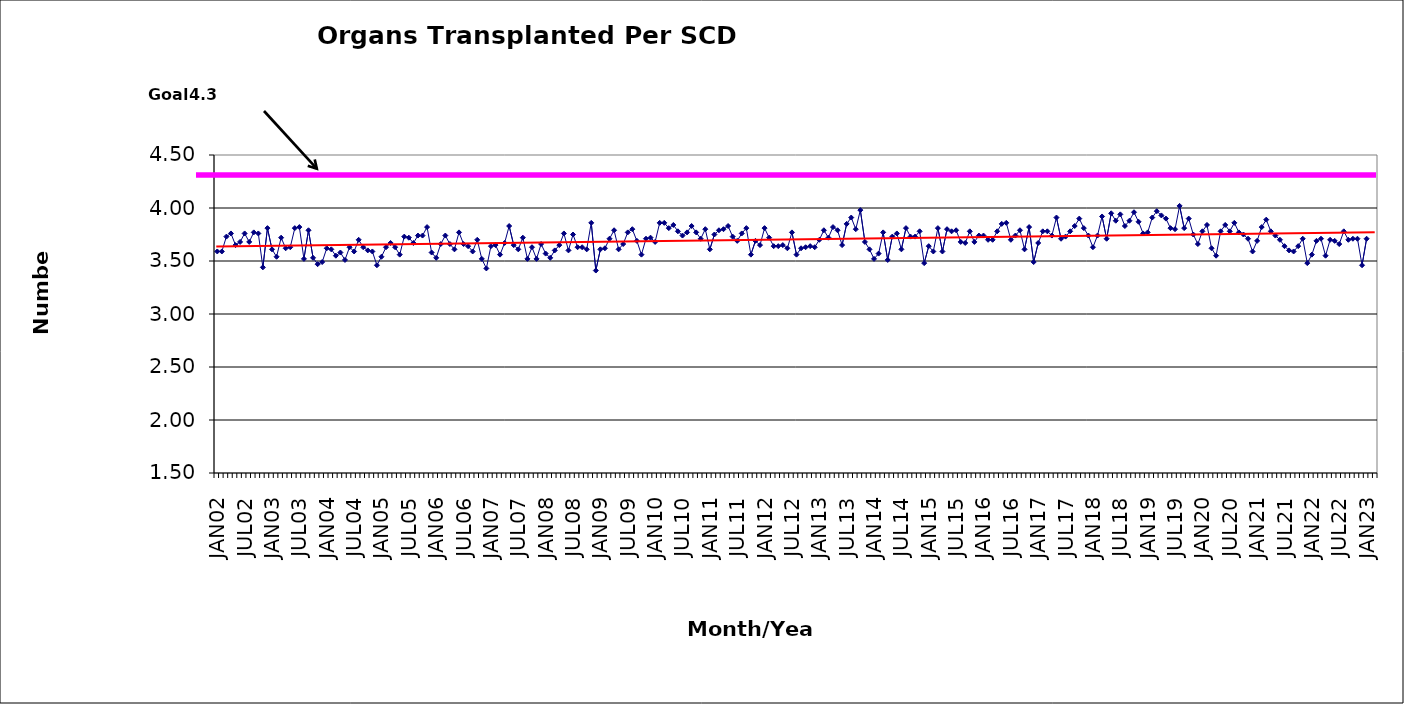
| Category | Series 0 |
|---|---|
| JAN02 | 3.59 |
| FEB02 | 3.59 |
| MAR02 | 3.73 |
| APR02 | 3.76 |
| MAY02 | 3.65 |
| JUN02 | 3.68 |
| JUL02 | 3.76 |
| AUG02 | 3.68 |
| SEP02 | 3.77 |
| OCT02 | 3.76 |
| NOV02 | 3.44 |
| DEC02 | 3.81 |
| JAN03 | 3.61 |
| FEB03 | 3.54 |
| MAR03 | 3.72 |
| APR03 | 3.62 |
| MAY03 | 3.63 |
| JUN03 | 3.81 |
| JUL03 | 3.82 |
| AUG03 | 3.52 |
| SEP03 | 3.79 |
| OCT03 | 3.53 |
| NOV03 | 3.47 |
| DEC03 | 3.49 |
| JAN04 | 3.62 |
| FEB04 | 3.61 |
| MAR04 | 3.55 |
| APR04 | 3.58 |
| MAY04 | 3.51 |
| JUN04 | 3.63 |
| JUL04 | 3.59 |
| AUG04 | 3.7 |
| SEP04 | 3.63 |
| OCT04 | 3.6 |
| NOV04 | 3.59 |
| DEC04 | 3.46 |
| JAN05 | 3.54 |
| FEB05 | 3.63 |
| MAR05 | 3.67 |
| APR05 | 3.63 |
| MAY05 | 3.56 |
| JUN05 | 3.73 |
| JUL05 | 3.72 |
| AUG05 | 3.67 |
| SEP05 | 3.74 |
| OCT05 | 3.74 |
| NOV05 | 3.82 |
| DEC05 | 3.58 |
| JAN06 | 3.53 |
| FEB06 | 3.66 |
| MAR06 | 3.74 |
| APR06 | 3.66 |
| MAY06 | 3.61 |
| JUN06 | 3.77 |
| JUL06 | 3.66 |
| AUG06 | 3.64 |
| SEP06 | 3.59 |
| OCT06 | 3.7 |
| NOV06 | 3.52 |
| DEC06 | 3.43 |
| JAN07 | 3.64 |
| FEB07 | 3.65 |
| MAR07 | 3.56 |
| APR07 | 3.67 |
| MAY07 | 3.83 |
| JUN07 | 3.65 |
| JUL07 | 3.61 |
| AUG07 | 3.72 |
| SEP07 | 3.52 |
| OCT07 | 3.63 |
| NOV07 | 3.52 |
| DEC07 | 3.66 |
| JAN08 | 3.57 |
| FEB08 | 3.53 |
| MAR08 | 3.6 |
| APR08 | 3.65 |
| MAY08 | 3.76 |
| JUN08 | 3.6 |
| JUL08 | 3.75 |
| AUG08 | 3.63 |
| SEP08 | 3.63 |
| OCT08 | 3.61 |
| NOV08 | 3.86 |
| DEC08 | 3.41 |
| JAN09 | 3.61 |
| FEB09 | 3.62 |
| MAR09 | 3.71 |
| APR09 | 3.79 |
| MAY09 | 3.61 |
| JUN09 | 3.66 |
| JUL09 | 3.77 |
| AUG09 | 3.8 |
| SEP09 | 3.69 |
| OCT09 | 3.56 |
| NOV09 | 3.71 |
| DEC09 | 3.72 |
| JAN10 | 3.68 |
| FEB10 | 3.86 |
| MAR10 | 3.86 |
| APR10 | 3.81 |
| MAY10 | 3.84 |
| JUN10 | 3.78 |
| JUL10 | 3.74 |
| AUG10 | 3.77 |
| SEP10 | 3.83 |
| OCT10 | 3.77 |
| NOV10 | 3.71 |
| DEC10 | 3.8 |
| JAN11 | 3.61 |
| FEB11 | 3.75 |
| MAR11 | 3.79 |
| APR11 | 3.8 |
| MAY11 | 3.83 |
| JUN11 | 3.73 |
| JUL11 | 3.69 |
| AUG11 | 3.76 |
| SEP11 | 3.81 |
| OCT11 | 3.56 |
| NOV11 | 3.69 |
| DEC11 | 3.65 |
| JAN12 | 3.81 |
| FEB12 | 3.72 |
| MAR12 | 3.64 |
| APR12 | 3.64 |
| MAY12 | 3.65 |
| JUN12 | 3.62 |
| JUL12 | 3.77 |
| AUG12 | 3.56 |
| SEP12 | 3.62 |
| OCT12 | 3.63 |
| NOV12 | 3.64 |
| DEC12 | 3.63 |
| JAN13 | 3.7 |
| FEB13 | 3.79 |
| MAR13 | 3.72 |
| APR13 | 3.82 |
| MAY13 | 3.79 |
| JUN13 | 3.65 |
| JUL13 | 3.85 |
| AUG13 | 3.91 |
| SEP13 | 3.8 |
| OCT13 | 3.98 |
| NOV13 | 3.68 |
| DEC13 | 3.61 |
| JAN14 | 3.52 |
| FEB14 | 3.57 |
| MAR14 | 3.77 |
| APR14 | 3.51 |
| MAY14 | 3.73 |
| JUN14 | 3.76 |
| JUL14 | 3.61 |
| AUG14 | 3.81 |
| SEP14 | 3.73 |
| OCT14 | 3.73 |
| NOV14 | 3.78 |
| DEC14 | 3.48 |
| JAN15 | 3.64 |
| FEB15 | 3.59 |
| MAR15 | 3.81 |
| APR15 | 3.59 |
| MAY15 | 3.8 |
| JUN15 | 3.78 |
| JUL15 | 3.79 |
| AUG15 | 3.68 |
| SEP15 | 3.67 |
| OCT15 | 3.78 |
| NOV15 | 3.68 |
| DEC15 | 3.74 |
| JAN16 | 3.74 |
| FEB16 | 3.7 |
| MAR16 | 3.7 |
| APR16 | 3.78 |
| MAY16 | 3.85 |
| JUN16 | 3.86 |
| JUL16 | 3.7 |
| AUG16 | 3.74 |
| SEP16 | 3.79 |
| OCT16 | 3.61 |
| NOV16 | 3.82 |
| DEC16 | 3.49 |
| JAN17 | 3.67 |
| FEB17 | 3.78 |
| MAR17 | 3.78 |
| APR17 | 3.74 |
| MAY17 | 3.91 |
| JUN17 | 3.71 |
| JUL17 | 3.73 |
| AUG17 | 3.78 |
| SEP17 | 3.83 |
| OCT17 | 3.9 |
| NOV17 | 3.81 |
| DEC17 | 3.74 |
| JAN18 | 3.63 |
| FEB18 | 3.74 |
| MAR18 | 3.92 |
| APR18 | 3.71 |
| MAY18 | 3.95 |
| JUN18 | 3.88 |
| JUL18 | 3.94 |
| AUG18 | 3.83 |
| SEP18 | 3.88 |
| OCT18 | 3.96 |
| NOV18 | 3.87 |
| DEC18 | 3.76 |
| JAN19 | 3.77 |
| FEB19 | 3.91 |
| MAR19 | 3.97 |
| APR19 | 3.93 |
| MAY19 | 3.9 |
| JUN19 | 3.81 |
| JUL19 | 3.8 |
| AUG19 | 4.02 |
| SEP19 | 3.81 |
| OCT19 | 3.9 |
| NOV19 | 3.75 |
| DEC19 | 3.66 |
| JAN20 | 3.78 |
| FEB20 | 3.84 |
| MAR20 | 3.62 |
| APR20 | 3.55 |
| MAY20 | 3.78 |
| JUN20 | 3.84 |
| JUL20 | 3.78 |
| AUG20 | 3.86 |
| SEP20 | 3.77 |
| OCT20 | 3.75 |
| NOV20 | 3.71 |
| DEC20 | 3.59 |
| JAN21 | 3.69 |
| FEB21 | 3.82 |
| MAR21 | 3.89 |
| APR21 | 3.78 |
| MAY21 | 3.74 |
| JUN21 | 3.7 |
| JUL21 | 3.64 |
| AUG21 | 3.6 |
| SEP21 | 3.59 |
| OCT21 | 3.64 |
| NOV21 | 3.71 |
| DEC21 | 3.48 |
| JAN22 | 3.56 |
| FEB22 | 3.69 |
| MAR22 | 3.71 |
| APR22 | 3.55 |
| MAY22 | 3.7 |
| JUN22 | 3.69 |
| JUL22 | 3.66 |
| AUG22 | 3.78 |
| SEP22 | 3.7 |
| OCT22 | 3.71 |
| NOV22 | 3.71 |
| DEC22 | 3.46 |
| JAN23 | 3.71 |